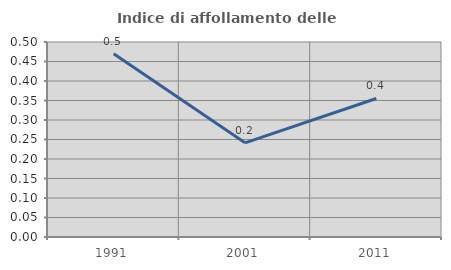
| Category | Indice di affollamento delle abitazioni  |
|---|---|
| 1991.0 | 0.47 |
| 2001.0 | 0.241 |
| 2011.0 | 0.355 |